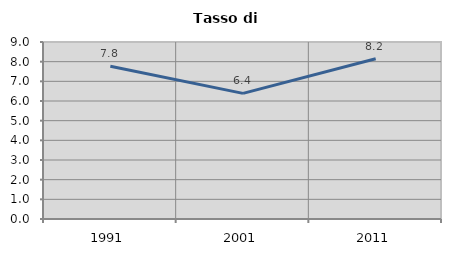
| Category | Tasso di disoccupazione   |
|---|---|
| 1991.0 | 7.763 |
| 2001.0 | 6.387 |
| 2011.0 | 8.151 |